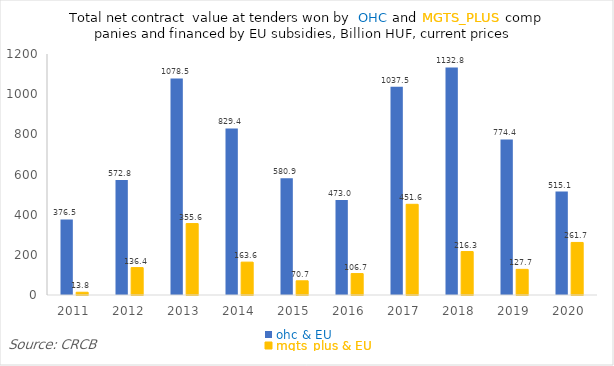
| Category | ohc & EU | mgts_plus & EU |
|---|---|---|
| 2011.0 | 376.496 | 13.769 |
| 2012.0 | 572.826 | 136.44 |
| 2013.0 | 1078.537 | 355.58 |
| 2014.0 | 829.373 | 163.634 |
| 2015.0 | 580.95 | 70.681 |
| 2016.0 | 473.024 | 106.667 |
| 2017.0 | 1037.476 | 451.617 |
| 2018.0 | 1132.805 | 216.298 |
| 2019.0 | 774.356 | 127.718 |
| 2020.0 | 515.147 | 261.681 |